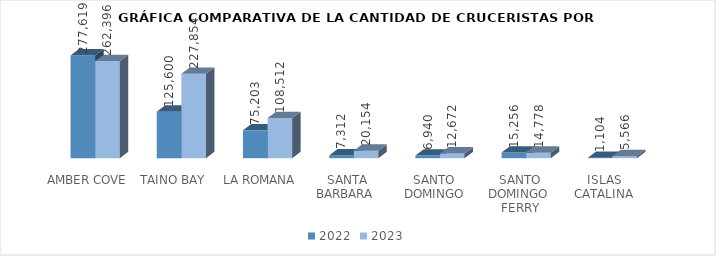
| Category | 2022 | 2023 |
|---|---|---|
| AMBER COVE | 277619 | 262396 |
| TAINO BAY | 125600 | 227854 |
| LA ROMANA | 75203 | 108512 |
| SANTA BARBARA  | 7312 | 20154 |
| SANTO DOMINGO | 6940 | 12672 |
| SANTO DOMINGO  FERRY | 15256 | 14778 |
| ISLAS  CATALINA  | 1104 | 5566 |